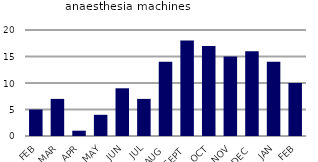
| Category | anaesthesia machines |
|---|---|
| FEB | 5 |
| MAR | 7 |
| APR | 1 |
| MAY | 4 |
| JUN | 9 |
| JUL | 7 |
| AUG | 14 |
| SEPT | 18 |
| OCT | 17 |
| NOV | 15 |
| DEC | 16 |
| JAN | 14 |
| FEB | 10 |